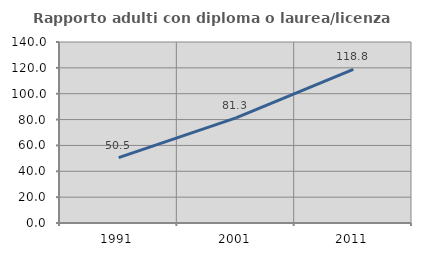
| Category | Rapporto adulti con diploma o laurea/licenza media  |
|---|---|
| 1991.0 | 50.535 |
| 2001.0 | 81.293 |
| 2011.0 | 118.843 |